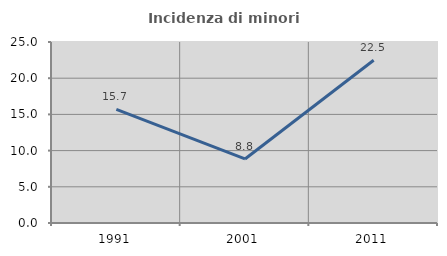
| Category | Incidenza di minori stranieri |
|---|---|
| 1991.0 | 15.686 |
| 2001.0 | 8.844 |
| 2011.0 | 22.479 |